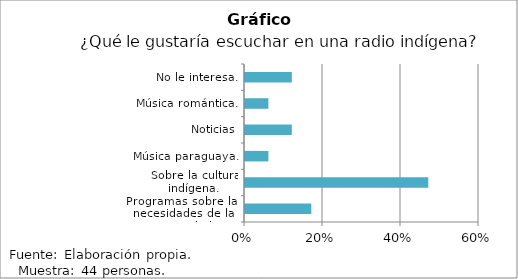
| Category | Series 0 |
|---|---|
| Programas sobre las necesidades de la comunidad. | 0.17 |
| Sobre la cultura indígena. | 0.47 |
| Música paraguaya. | 0.06 |
| Noticias | 0.12 |
| Música romántica. | 0.06 |
| No le interesa. | 0.12 |